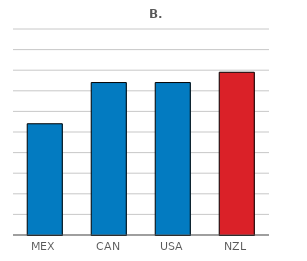
| Category | Series 0 |
|---|---|
| MEX | 54 |
| CAN | 74 |
| USA | 74 |
| NZL | 79 |